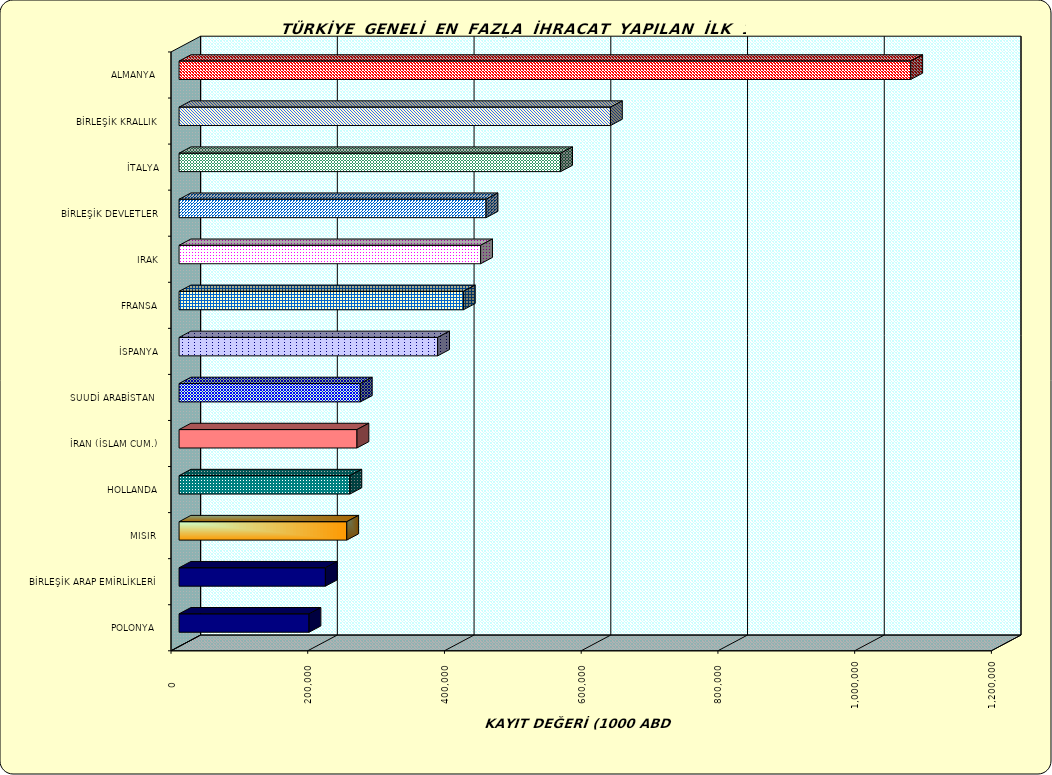
| Category | Series 0 |
|---|---|
| ALMANYA  | 1070259.124 |
| BİRLEŞİK KRALLIK | 631011.687 |
| İTALYA | 558135.127 |
| BİRLEŞİK DEVLETLER | 449071.757 |
| IRAK | 441070.089 |
| FRANSA | 415852.498 |
| İSPANYA | 378216.097 |
| SUUDİ ARABİSTAN  | 265130.391 |
| İRAN (İSLAM CUM.) | 260204.567 |
| HOLLANDA | 249888.032 |
| MISIR  | 245283.609 |
| BİRLEŞİK ARAP EMİRLİKLERİ | 214029.178 |
| POLONYA  | 190069.361 |